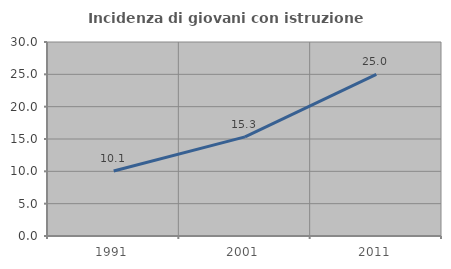
| Category | Incidenza di giovani con istruzione universitaria |
|---|---|
| 1991.0 | 10.063 |
| 2001.0 | 15.328 |
| 2011.0 | 25 |